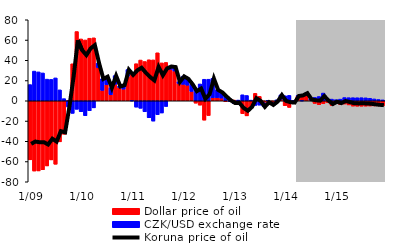
| Category | Dollar price of oil | CZK/USD exchange rate |
|---|---|---|
|  1/09 | -58.318 | 16.006 |
| 2 | -69.4 | 29.347 |
| 3 | -69.287 | 28.538 |
| 4 | -68.163 | 27.498 |
| 5 | -64.354 | 21.394 |
| 6 | -58.395 | 21.136 |
| 7 | -62.697 | 22.603 |
| 8 | -40.548 | 10.781 |
| 9 | -33.074 | 2.13 |
| 10 | 0.318 | -6.15 |
| 11 | 36.53 | -12.428 |
| 12 | 68.408 | -8.414 |
|  1/10 | 61.08 | -10.819 |
| 2 | 60.085 | -14.734 |
| 3 | 61.793 | -9.884 |
| 4 | 62.185 | -6.995 |
| 5 | 32.816 | 4.415 |
| 6 | 10.283 | 11.518 |
| 7 | 15.804 | 8.178 |
| 8 | 5.946 | 7.054 |
| 9 | 16.357 | 8.533 |
| 10 | 13.142 | 1.183 |
| 11 | 11.513 | 4.148 |
| 12 | 24.174 | 6.662 |
|  1/11 | 25.824 | -0.03 |
| 2 | 36.638 | -6.295 |
| 3 | 40.235 | -7.426 |
| 4 | 38.796 | -10.894 |
| 5 | 40.539 | -16.816 |
| 6 | 40.4 | -20.074 |
| 7 | 47.416 | -13.691 |
| 8 | 37.414 | -12.066 |
| 9 | 37.886 | -5.648 |
| 10 | 31.121 | 2.958 |
| 11 | 29.402 | 4.114 |
| 12 | 17.064 | 1.772 |
|  1/12 | 16.222 | 8.082 |
| 2 | 15.381 | 6.478 |
| 3 | 9.236 | 7.28 |
| 4 | -2.371 | 12.081 |
| 5 | -4.311 | 16.622 |
| 6 | -19.138 | 21.271 |
| 7 | -14.578 | 21.302 |
| 8 | 2.986 | 19.252 |
| 9 | 3.073 | 7.922 |
| 10 | 2.659 | 5.82 |
| 11 | -0.919 | 5.323 |
| 12 | 1.358 | -0.697 |
|  1/13 | 0.76 | -2.775 |
| 2 | -2.527 | 0.711 |
| 3 | -12.763 | 5.955 |
| 4 | -14.903 | 5.242 |
| 5 | -6.4 | 0.658 |
| 6 | 7.375 | -4.582 |
| 7 | 4.382 | -4.295 |
| 8 | -1.902 | -3.867 |
| 9 | -1.58 | 0.387 |
| 10 | -1.827 | -2.047 |
| 11 | -1.496 | 0.91 |
| 12 | 1.439 | 4.413 |
|  1/14 | -4.869 | 4.979 |
| 2 | -6.569 | 5.353 |
| 3 | -1.639 | 0.061 |
| 4 | 4.659 | 0.306 |
| 5 | 5.585 | -0.03 |
| 6 | 5.371 | 2.351 |
| 7 | 0.796 | 0.872 |
| 8 | -2.615 | 3.329 |
| 9 | -3.907 | 4.24 |
| 10 | -2.823 | 7.637 |
| 11 | -1.707 | 2.043 |
| 12 | -4.626 | 1.644 |
|  1/15 | -1.764 | 1.084 |
| 2 | -3.73 | 1.626 |
| 3 | -3.205 | 3.193 |
| 4 | -4.081 | 3.066 |
| 5 | -5.263 | 3.062 |
| 6 | -5.387 | 3.023 |
| 7 | -5.377 | 3.066 |
| 8 | -5.279 | 2.905 |
| 9 | -5.173 | 2.46 |
| 10 | -5.092 | 1.84 |
| 11 | -5.035 | 1.275 |
| 12 | -4.973 | 0.875 |